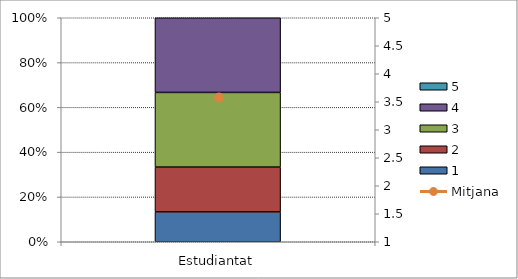
| Category | 1 | 2 | 3 | 4 | 5 |
|---|---|---|---|---|---|
| Estudiantat | 2 | 3 | 5 | 5 | 0 |